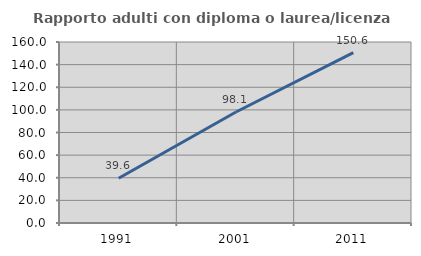
| Category | Rapporto adulti con diploma o laurea/licenza media  |
|---|---|
| 1991.0 | 39.604 |
| 2001.0 | 98.113 |
| 2011.0 | 150.575 |